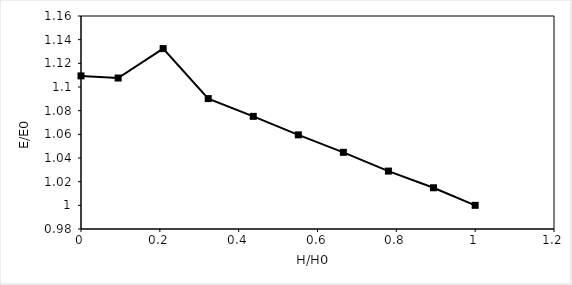
| Category | System 14 |
|---|---|
| 1.0 | 1 |
| 0.8941798941798942 | 1.015 |
| 0.7798941798941799 | 1.029 |
| 0.6656084656084655 | 1.045 |
| 0.5513227513227513 | 1.06 |
| 0.437037037037037 | 1.075 |
| 0.32275132275132273 | 1.09 |
| 0.20846560846560844 | 1.132 |
| 0.09417989417989416 | 1.108 |
| 0.0 | 1.109 |